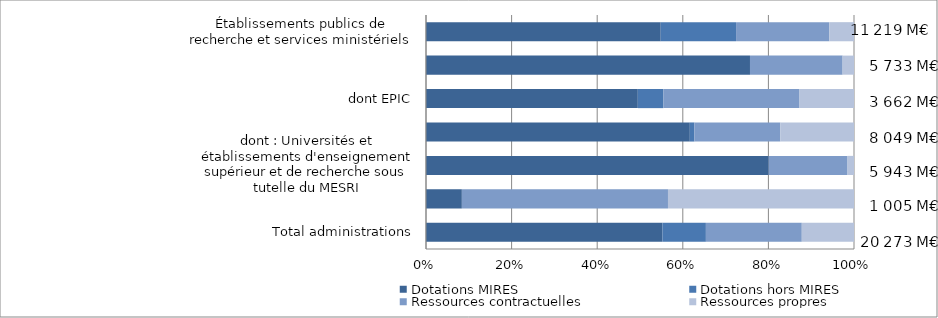
| Category | Dotations MIRES | Dotations hors MIRES | Ressources contractuelles | Ressources propres |
|---|---|---|---|---|
| Total administrations | 55.237 | 10.16 | 22.405 | 12.198 |
| Institutions sans but lucratif | 8.38 | 0 | 48.157 | 43.463 |
| dont : Universités et établissements d'enseignement supérieur et de recherche sous tutelle du MESRI | 80.06 | 0 | 18.432 | 1.508 |
| Établissements d'enseignement supérieur et de recherche | 61.642 | 1.053 | 20.084 | 17.221 |
| dont EPIC | 49.489 | 5.982 | 31.802 | 12.728 |
| dont EPST (y compris le CNRS) | 75.697 | 0 | 21.642 | 2.661 |
| Établissements publics de recherche et services ministériels | 54.841 | 17.603 | 21.763 | 5.793 |